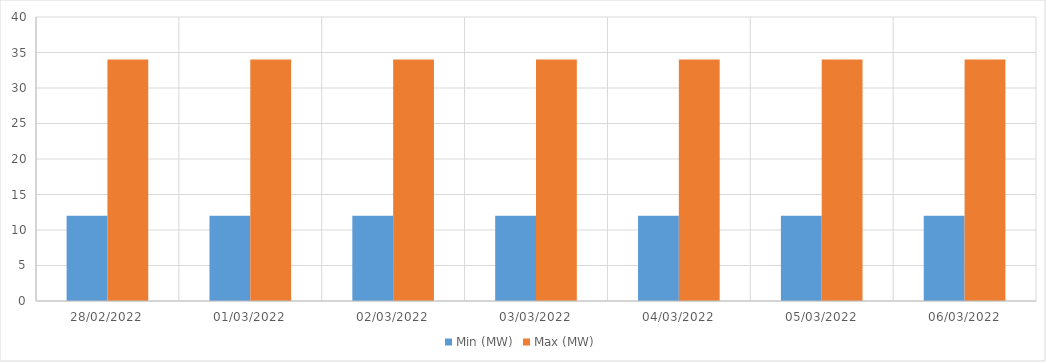
| Category | Min (MW) | Max (MW) |
|---|---|---|
| 28/02/2022 | 12 | 34 |
| 01/03/2022 | 12 | 34 |
| 02/03/2022 | 12 | 34 |
| 03/03/2022 | 12 | 34 |
| 04/03/2022 | 12 | 34 |
| 05/03/2022 | 12 | 34 |
| 06/03/2022 | 12 | 34 |